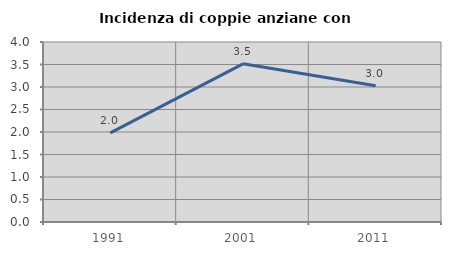
| Category | Incidenza di coppie anziane con figli |
|---|---|
| 1991.0 | 1.981 |
| 2001.0 | 3.515 |
| 2011.0 | 3.03 |